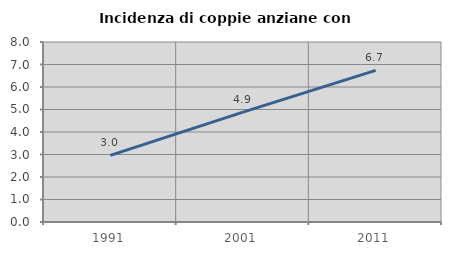
| Category | Incidenza di coppie anziane con figli |
|---|---|
| 1991.0 | 2.962 |
| 2001.0 | 4.886 |
| 2011.0 | 6.737 |